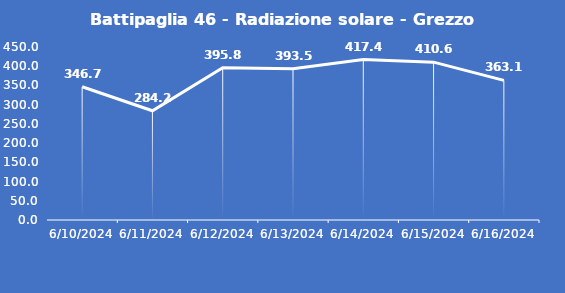
| Category | Battipaglia 46 - Radiazione solare - Grezzo (W/m2) |
|---|---|
| 6/10/24 | 346.7 |
| 6/11/24 | 284.2 |
| 6/12/24 | 395.8 |
| 6/13/24 | 393.5 |
| 6/14/24 | 417.4 |
| 6/15/24 | 410.6 |
| 6/16/24 | 363.1 |